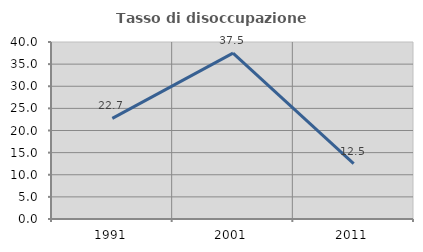
| Category | Tasso di disoccupazione giovanile  |
|---|---|
| 1991.0 | 22.727 |
| 2001.0 | 37.5 |
| 2011.0 | 12.5 |